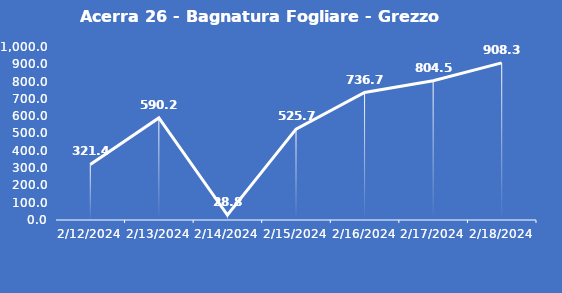
| Category | Acerra 26 - Bagnatura Fogliare - Grezzo (min) |
|---|---|
| 2/12/24 | 321.4 |
| 2/13/24 | 590.2 |
| 2/14/24 | 28.8 |
| 2/15/24 | 525.7 |
| 2/16/24 | 736.7 |
| 2/17/24 | 804.5 |
| 2/18/24 | 908.3 |